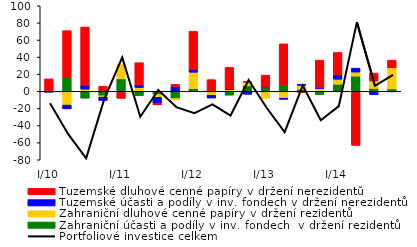
| Category | Zahraniční účasti a podíly v inv. fondech  v držení rezidentů  | Zahraniční dluhové cenné papíry v držení rezidentů  | Tuzemské účasti a podíly v inv. fondech v držení nerezidentů | Tuzemské dluhové cenné papíry v držení nerezidentů  |
|---|---|---|---|---|
| I/10 | -0.17 | 0.142 | -0.817 | 14.426 |
| II | 16.467 | -16.027 | -4.451 | 54.462 |
| III | -7.964 | 2.563 | 4.6 | 68.052 |
| IV | -5.164 | -1.632 | -3.738 | 6.036 |
| I/11 | 14.567 | 17.185 | -0.812 | -7.345 |
| II | -4.896 | 4.506 | 2.914 | 26.084 |
| III | -3.713 | -3.275 | -7.125 | -1.717 |
| IV | -8.33 | -1.701 | 5.325 | 2.798 |
| I/12 | 3.306 | 19.066 | 2.798 | 44.867 |
| II | -1.1 | -3.438 | -3.249 | 13.669 |
| III | -4.429 | 2.169 | 0.915 | 24.887 |
| IV | 6.453 | 4.343 | -3.402 | 0.733 |
| I/13 | 4.078 | -8.168 | 0.714 | 14.146 |
| II | 7.436 | -8.051 | -1.279 | 48.104 |
| III | 2.417 | 4.579 | 1.224 | -1.376 |
| IV | -3.652 | 3.278 | 1.402 | 31.82 |
| I/14 | 8.294 | 5.918 | 5.024 | 26.183 |
| II | 17.782 | 4.744 | 4.546 | -63.167 |
| III | 3.481 | 8.634 | -3.872 | 9.272 |
| IV | 2.772 | 24.934 | -0.485 | 8.788 |